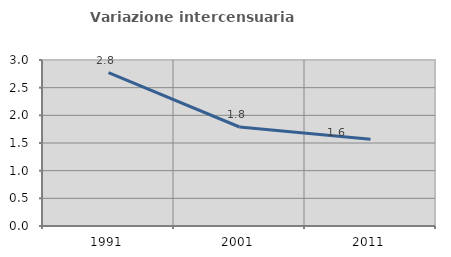
| Category | Variazione intercensuaria annua |
|---|---|
| 1991.0 | 2.771 |
| 2001.0 | 1.789 |
| 2011.0 | 1.57 |